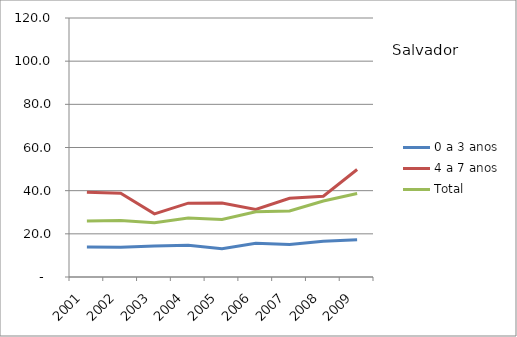
| Category | 0 a 3 anos | 4 a 7 anos | Total |
|---|---|---|---|
| 2001.0 | 13.94 | 39.3 | 25.94 |
| 2002.0 | 13.79 | 38.76 | 26.13 |
| 2003.0 | 14.31 | 29.24 | 25.11 |
| 2004.0 | 14.74 | 34.22 | 27.32 |
| 2005.0 | 13.08 | 34.26 | 26.67 |
| 2006.0 | 15.58 | 31.3 | 30.21 |
| 2007.0 | 15.02 | 36.5 | 30.62 |
| 2008.0 | 16.58 | 37.39 | 35.22 |
| 2009.0 | 17.29 | 49.79 | 38.65 |